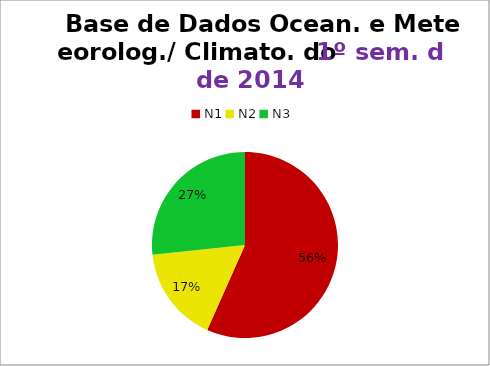
| Category | 1º/14 |
|---|---|
| N1 | 17 |
| N2 | 5 |
| N3 | 8 |